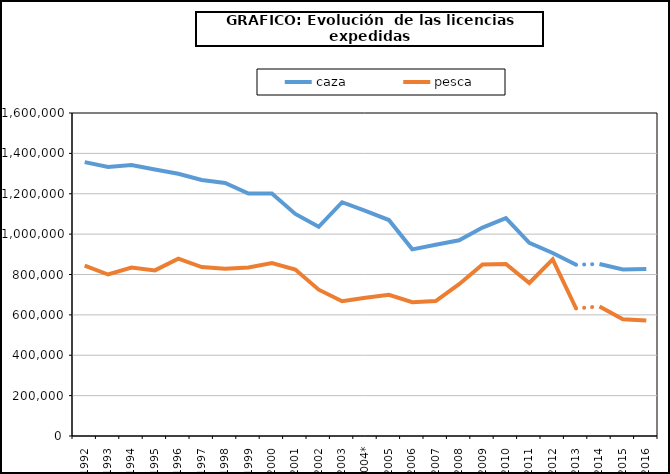
| Category | caza | pesca |
|---|---|---|
| 1992 | 1356553 | 844299 |
| 1993 | 1332252 | 799990 |
| 1994 | 1342603 | 834085 |
| 1995 | 1320315 | 820252 |
| 1996 | 1298860 | 878282 |
| 1997 | 1268057 | 837092 |
| 1998 | 1253105 | 829083 |
| 1999 | 1200951 | 834680 |
| 2000 | 1200875 | 856450 |
| 2001 | 1099856 | 825020 |
| 2002 | 1036340 | 724800 |
| 2003 | 1157969 | 667655 |
| 2004* | 1115000 | 685000 |
| 2005 | 1069804 | 699078 |
| 2006 | 924524 | 663000 |
| 2007 | 946965 | 668685 |
| 2008 | 969298 | 751937 |
| 2009 | 1032242 | 849102 |
| 2010 | 1078852 | 851759 |
| 2011 | 957191 | 758018 |
| 2012 | 906437 | 874802 |
| 2013 | 848243 | 631643 |
| 2014 | 851894 | 641819 |
| 2015 | 825374 | 578707 |
| 2016 | 826777 | 572495 |